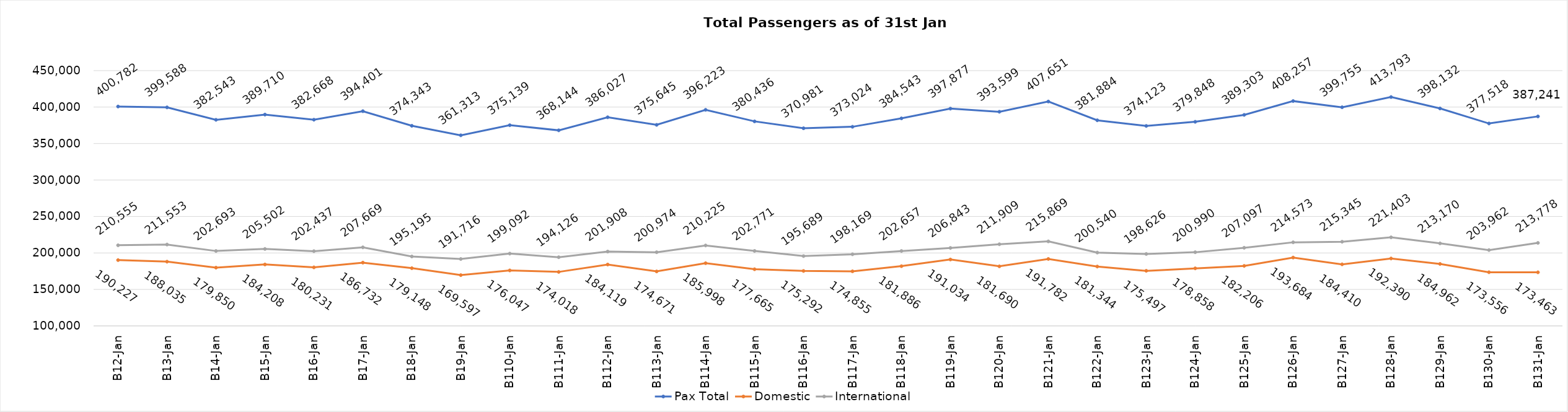
| Category | Pax Total | Domestic | International |
|---|---|---|---|
| 2024-01-02 | 400782 | 190227 | 210555 |
| 2024-01-03 | 399588 | 188035 | 211553 |
| 2024-01-04 | 382543 | 179850 | 202693 |
| 2024-01-05 | 389710 | 184208 | 205502 |
| 2024-01-06 | 382668 | 180231 | 202437 |
| 2024-01-07 | 394401 | 186732 | 207669 |
| 2024-01-08 | 374343 | 179148 | 195195 |
| 2024-01-09 | 361313 | 169597 | 191716 |
| 2024-01-10 | 375139 | 176047 | 199092 |
| 2024-01-11 | 368144 | 174018 | 194126 |
| 2024-01-12 | 386027 | 184119 | 201908 |
| 2024-01-13 | 375645 | 174671 | 200974 |
| 2024-01-14 | 396223 | 185998 | 210225 |
| 2024-01-15 | 380436 | 177665 | 202771 |
| 2024-01-16 | 370981 | 175292 | 195689 |
| 2024-01-17 | 373024 | 174855 | 198169 |
| 2024-01-18 | 384543 | 181886 | 202657 |
| 2024-01-19 | 397877 | 191034 | 206843 |
| 2024-01-20 | 393599 | 181690 | 211909 |
| 2024-01-21 | 407651 | 191782 | 215869 |
| 2024-01-22 | 381884 | 181344 | 200540 |
| 2024-01-23 | 374123 | 175497 | 198626 |
| 2024-01-24 | 379848 | 178858 | 200990 |
| 2024-01-25 | 389303 | 182206 | 207097 |
| 2024-01-26 | 408257 | 193684 | 214573 |
| 2024-01-27 | 399755 | 184410 | 215345 |
| 2024-01-28 | 413793 | 192390 | 221403 |
| 2024-01-29 | 398132 | 184962 | 213170 |
| 2024-01-30 | 377518 | 173556 | 203962 |
| 2024-01-31 | 387241 | 173463 | 213778 |